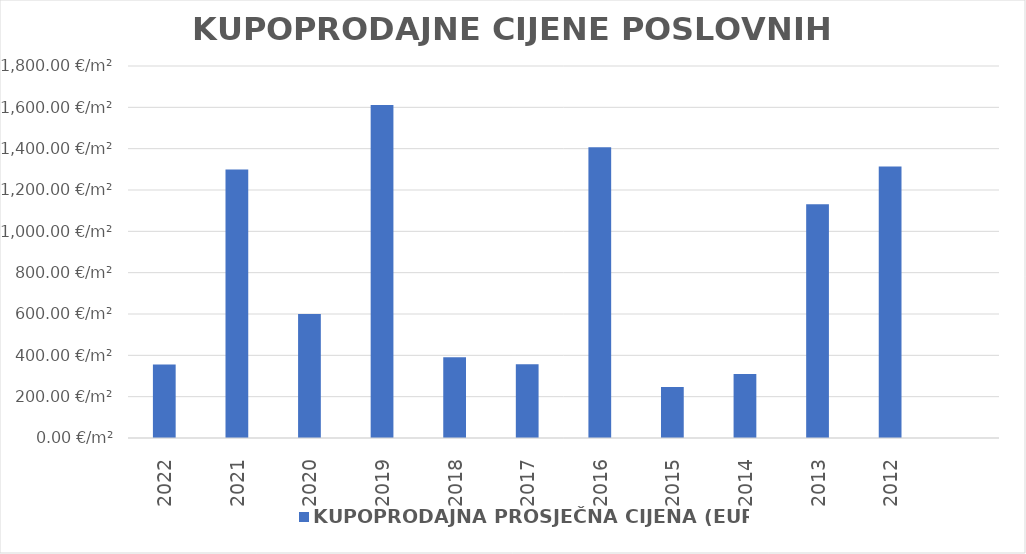
| Category | KUPOPRODAJNA PROSJEČNA CIJENA (EUR/m²) |
|---|---|
| 2022 | 1900-12-20 02:28:21 |
| 2021 | 1903-07-22 03:24:10 |
| 2020 | 1901-08-21 18:53:11 |
| 2019 | 1904-05-29 00:16:55 |
| 2018 | 1901-01-24 22:33:11 |
| 2017 | 1900-12-22 08:56:05 |
| 2016 | 1903-11-06 19:30:46 |
| 2015 | 1900-09-02 23:16:40 |
| 2014 | 1900-11-05 03:39:42 |
| 2013 | 1903-02-04 03:05:21 |
| 2012 | 1903-08-05 18:33:26 |